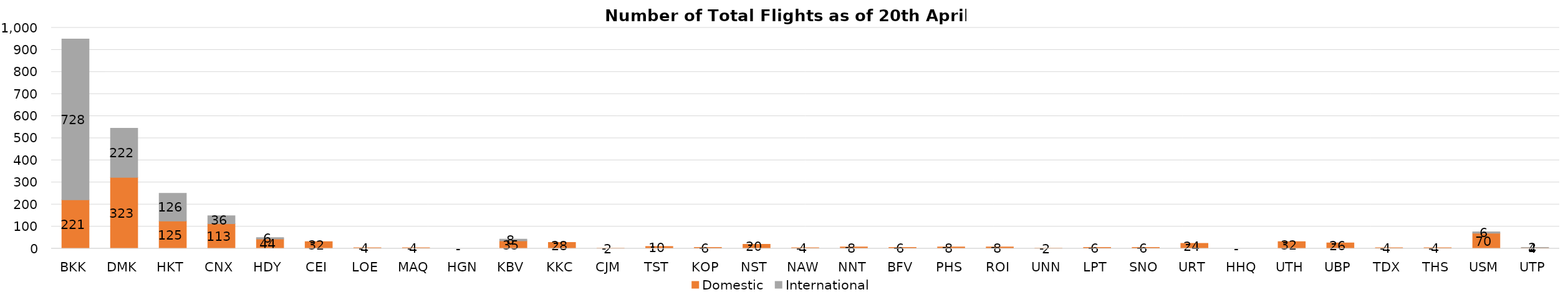
| Category | Domestic | International |
|---|---|---|
| BKK | 221 | 728 |
| DMK | 323 | 222 |
| HKT | 125 | 126 |
| CNX | 113 | 36 |
| HDY | 44 | 6 |
| CEI | 32 | 0 |
| LOE | 4 | 0 |
| MAQ | 4 | 0 |
| HGN | 0 | 0 |
| KBV | 35 | 8 |
| KKC | 28 | 0 |
| CJM | 2 | 0 |
| TST | 10 | 0 |
| KOP | 6 | 0 |
| NST | 20 | 0 |
| NAW | 4 | 0 |
| NNT | 8 | 0 |
| BFV | 6 | 0 |
| PHS | 8 | 0 |
| ROI | 8 | 0 |
| UNN | 2 | 0 |
| LPT | 6 | 0 |
| SNO | 6 | 0 |
| URT | 24 | 0 |
| HHQ | 0 | 0 |
| UTH | 32 | 0 |
| UBP | 26 | 0 |
| TDX | 4 | 0 |
| THS | 4 | 0 |
| USM | 70 | 6 |
| UTP | 4 | 2 |